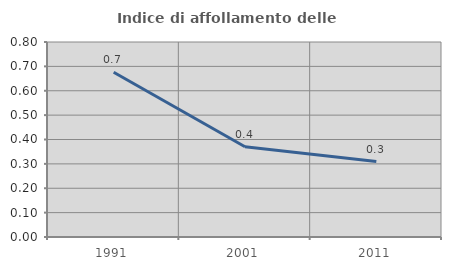
| Category | Indice di affollamento delle abitazioni  |
|---|---|
| 1991.0 | 0.676 |
| 2001.0 | 0.37 |
| 2011.0 | 0.31 |